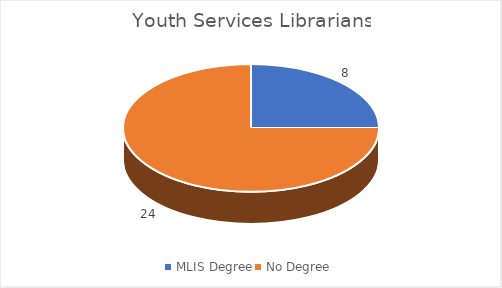
| Category | Series 0 |
|---|---|
| MLIS Degree | 8 |
| No Degree  | 24 |